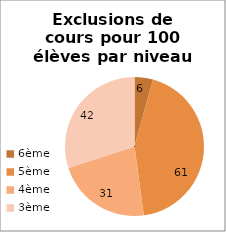
| Category | Series 0 |
|---|---|
| 6ème | 6 |
| 5ème | 61 |
| 4ème | 31 |
| 3ème | 42 |